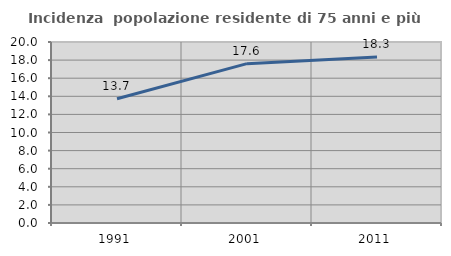
| Category | Incidenza  popolazione residente di 75 anni e più |
|---|---|
| 1991.0 | 13.725 |
| 2001.0 | 17.606 |
| 2011.0 | 18.333 |